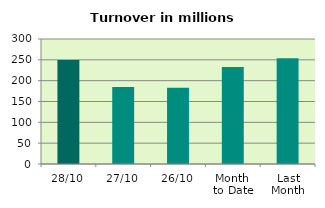
| Category | Series 0 |
|---|---|
| 28/10 | 249.477 |
| 27/10 | 184.557 |
| 26/10 | 182.798 |
| Month 
to Date | 232.925 |
| Last
Month | 253.961 |